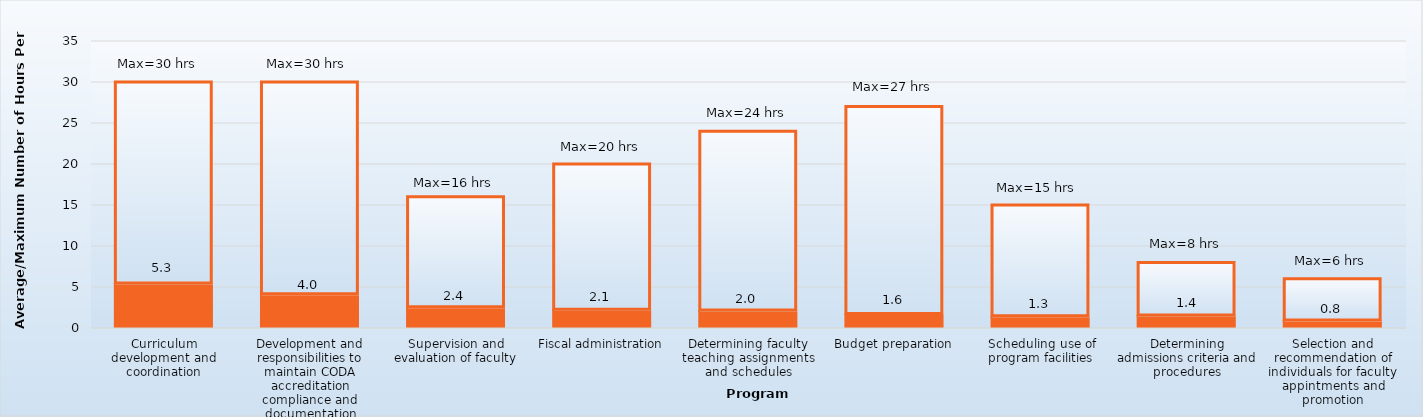
| Category | Average hours per week | Maximum |
|---|---|---|
| Curriculum development and coordination | 5.3 | 24.7 |
| Development and responsibilities to maintain CODA accreditation compliance and documentation | 4 | 26 |
| Supervision and evaluation of faculty | 2.4 | 13.6 |
| Fiscal administration | 2.1 | 17.9 |
| Determining faculty teaching assignments and schedules | 2 | 22 |
| Budget preparation | 1.6 | 25.4 |
| Scheduling use of program facilities | 1.3 | 13.7 |
| Determining admissions criteria and procedures | 1.4 | 6.6 |
| Selection and recommendation of individuals for faculty appintments and promotion | 0.8 | 5.2 |